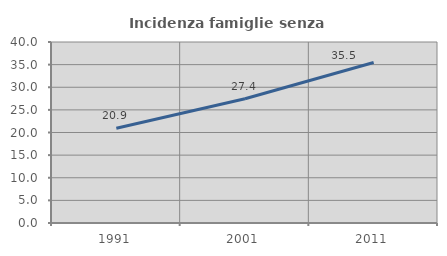
| Category | Incidenza famiglie senza nuclei |
|---|---|
| 1991.0 | 20.946 |
| 2001.0 | 27.447 |
| 2011.0 | 35.471 |